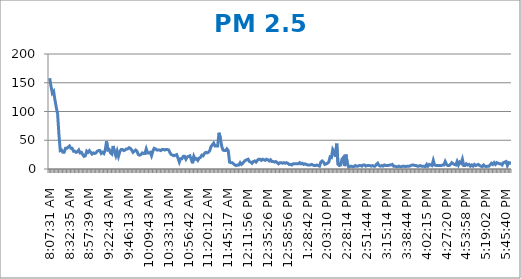
| Category | PM 2.5 (µg/m3) |
|---|---|
| 0.3385532407407407 | 158 |
| 0.3396412037037037 | 144 |
| 0.3407291666666667 | 132 |
| 0.3418171296296297 | 135 |
| 0.34290509259259255 | 120 |
| 0.34399305555555554 | 107 |
| 0.3450810185185185 | 96 |
| 0.34616898148148145 | 60 |
| 0.34725694444444444 | 32 |
| 0.34943287037037035 | 33 |
| 0.35052083333333334 | 29 |
| 0.3516087962962963 | 29 |
| 0.3526967592592593 | 36 |
| 0.3537847222222222 | 36 |
| 0.35487268518518517 | 38 |
| 0.35596064814814815 | 40 |
| 0.3570486111111111 | 36 |
| 0.35813657407407407 | 36 |
| 0.35922453703703705 | 31 |
| 0.36031250000000004 | 31 |
| 0.36140046296296297 | 29 |
| 0.36248842592592595 | 30 |
| 0.3646643518518518 | 33 |
| 0.3657523148148148 | 28 |
| 0.3668402777777778 | 29 |
| 0.3679282407407407 | 25 |
| 0.3690162037037037 | 22 |
| 0.3701041666666667 | 23 |
| 0.37119212962962966 | 31 |
| 0.3722800925925926 | 29 |
| 0.3733680555555556 | 32 |
| 0.37445601851851856 | 29 |
| 0.37554398148148144 | 26 |
| 0.3766319444444444 | 28 |
| 0.3777199074074074 | 27 |
| 0.37880787037037034 | 28 |
| 0.3798958333333333 | 31 |
| 0.3809837962962963 | 32 |
| 0.3820717592592593 | 32 |
| 0.3831597222222222 | 27 |
| 0.3842476851851852 | 29 |
| 0.3853356481481482 | 27 |
| 0.38642361111111106 | 33 |
| 0.38751157407407405 | 48 |
| 0.38968749999999996 | 33 |
| 0.39077546296296295 | 34 |
| 0.39186342592592593 | 28 |
| 0.3929513888888889 | 26 |
| 0.39403935185185185 | 40 |
| 0.39512731481481483 | 30 |
| 0.3962152777777778 | 23 |
| 0.3973032407407407 | 31 |
| 0.3983912037037037 | 22 |
| 0.39947916666666666 | 30 |
| 0.40056712962962965 | 34 |
| 0.4016550925925926 | 34 |
| 0.40274305555555556 | 32 |
| 0.40383101851851855 | 33 |
| 0.4049189814814815 | 35 |
| 0.40600694444444446 | 35 |
| 0.40709490740740745 | 37 |
| 0.4081828703703703 | 36 |
| 0.4092708333333333 | 33 |
| 0.4103587962962963 | 29 |
| 0.4114467592592593 | 31 |
| 0.4125347222222222 | 33 |
| 0.4136226851851852 | 31 |
| 0.4147106481481482 | 25 |
| 0.4157986111111111 | 24 |
| 0.4168865740740741 | 25 |
| 0.4179745370370371 | 28 |
| 0.41906249999999995 | 27 |
| 0.42015046296296293 | 27 |
| 0.4212384259259259 | 35 |
| 0.4223263888888889 | 28 |
| 0.42341435185185183 | 28 |
| 0.4245023148148148 | 29 |
| 0.4255902777777778 | 23 |
| 0.42667824074074073 | 31 |
| 0.4277662037037037 | 36 |
| 0.4288541666666667 | 35 |
| 0.4299421296296296 | 33 |
| 0.43103009259259256 | 33 |
| 0.43211805555555555 | 33 |
| 0.43320601851851853 | 32 |
| 0.43429398148148146 | 34 |
| 0.43538194444444445 | 34 |
| 0.43646990740740743 | 33 |
| 0.43755787037037036 | 34 |
| 0.43864583333333335 | 34 |
| 0.43973379629629633 | 33 |
| 0.4408217592592592 | 28 |
| 0.4419097222222222 | 25 |
| 0.4429976851851852 | 24 |
| 0.44408564814814816 | 23 |
| 0.4451736111111111 | 24 |
| 0.4462615740740741 | 25 |
| 0.44734953703703706 | 19 |
| 0.4484375 | 12 |
| 0.449525462962963 | 18 |
| 0.4506018518518518 | 18 |
| 0.4516898148148148 | 22 |
| 0.4527777777777778 | 22 |
| 0.4538657407407407 | 17 |
| 0.4549537037037037 | 21 |
| 0.4560416666666667 | 22 |
| 0.45712962962962966 | 23 |
| 0.4582175925925926 | 17 |
| 0.4593055555555556 | 10 |
| 0.46039351851851856 | 22 |
| 0.46148148148148144 | 17 |
| 0.4625694444444444 | 18 |
| 0.4636574074074074 | 15 |
| 0.46474537037037034 | 19 |
| 0.4658333333333333 | 20 |
| 0.4669212962962963 | 24 |
| 0.4680092592592593 | 23 |
| 0.4690972222222222 | 27 |
| 0.4701851851851852 | 29 |
| 0.4712731481481482 | 28 |
| 0.47236111111111106 | 29 |
| 0.47344907407407405 | 32 |
| 0.47453703703703703 | 39 |
| 0.47562499999999996 | 42 |
| 0.47671296296296295 | 45 |
| 0.47780092592592593 | 40 |
| 0.4788888888888889 | 40 |
| 0.47997685185185185 | 40 |
| 0.4821527777777778 | 63 |
| 0.4832407407407407 | 54 |
| 0.4843287037037037 | 40 |
| 0.48541666666666666 | 33 |
| 0.4865162037037037 | 32 |
| 0.48760416666666667 | 32 |
| 0.4886921296296296 | 35 |
| 0.4897800925925926 | 32 |
| 0.49086805555555557 | 12 |
| 0.4919560185185185 | 11 |
| 0.4930439814814815 | 11 |
| 0.49413194444444447 | 9 |
| 0.4952314814814815 | 7 |
| 0.4963194444444445 | 6 |
| 0.49740740740740735 | 7 |
| 0.49849537037037034 | 7 |
| 0.4995833333333333 | 11 |
| 0.5006712962962964 | 8 |
| 0.5039351851851852 | 10 |
| 0.5050231481481481 | 13 |
| 0.5061111111111111 | 15 |
| 0.507199074074074 | 16 |
| 0.508287037037037 | 17 |
| 0.509375 | 13 |
| 0.510462962962963 | 12 |
| 0.511550925925926 | 10 |
| 0.5126388888888889 | 13 |
| 0.5137268518518519 | 14 |
| 0.5148148148148148 | 12 |
| 0.5159027777777777 | 15 |
| 0.5169907407407407 | 17 |
| 0.5180787037037037 | 17 |
| 0.5191666666666667 | 15 |
| 0.5202546296296297 | 17 |
| 0.5213425925925926 | 16 |
| 0.5224305555555556 | 15 |
| 0.5235185185185185 | 17 |
| 0.5246064814814815 | 16 |
| 0.5256944444444445 | 14 |
| 0.5267824074074073 | 16 |
| 0.5278703703703703 | 13 |
| 0.5289583333333333 | 13 |
| 0.5300462962962963 | 12 |
| 0.5311342592592593 | 13 |
| 0.5322222222222223 | 11 |
| 0.5333101851851852 | 9 |
| 0.5343981481481481 | 11 |
| 0.5354861111111111 | 11 |
| 0.5365740740740741 | 10 |
| 0.537662037037037 | 11 |
| 0.53875 | 10 |
| 0.5398379629629629 | 11 |
| 0.5409259259259259 | 10 |
| 0.5420138888888889 | 8 |
| 0.5431018518518519 | 8 |
| 0.5441898148148149 | 7 |
| 0.5452777777777778 | 9 |
| 0.5463657407407407 | 9 |
| 0.5474537037037037 | 9 |
| 0.5485416666666666 | 9 |
| 0.5496296296296296 | 9 |
| 0.5507175925925926 | 11 |
| 0.5518055555555555 | 9 |
| 0.5528935185185185 | 10 |
| 0.5539814814814815 | 8 |
| 0.5572453703703704 | 9 |
| 0.5605092592592592 | 8 |
| 0.5615972222222222 | 7 |
| 0.5626851851851852 | 7 |
| 0.5659490740740741 | 7 |
| 0.567037037037037 | 8 |
| 0.568125 | 7 |
| 0.569212962962963 | 6 |
| 0.570300925925926 | 6 |
| 0.5724768518518518 | 7 |
| 0.5735648148148148 | 6 |
| 0.5790046296296296 | 5 |
| 0.5800925925925926 | 12 |
| 0.5811805555555556 | 14 |
| 0.5822685185185185 | 12 |
| 0.5833564814814814 | 8 |
| 0.5844444444444444 | 9 |
| 0.5855324074074074 | 10 |
| 0.5866203703703704 | 12 |
| 0.5877083333333334 | 21 |
| 0.5887962962962963 | 20 |
| 0.5898842592592592 | 34 |
| 0.5909722222222222 | 30 |
| 0.5931481481481481 | 21 |
| 0.5942361111111111 | 44 |
| 0.5953240740740741 | 8 |
| 0.596412037037037 | 6 |
| 0.5975 | 7 |
| 0.598587962962963 | 17 |
| 0.599675925925926 | 20 |
| 0.6007638888888889 | 5 |
| 0.6018518518518519 | 25 |
| 0.6029398148148148 | 10 |
| 0.6040277777777777 | 3 |
| 0.6051157407407407 | 5 |
| 0.6062037037037037 | 5 |
| 0.6072916666666667 | 4 |
| 0.6083796296296297 | 4 |
| 0.6094675925925926 | 6 |
| 0.6105555555555556 | 5 |
| 0.6116435185185185 | 5 |
| 0.6127314814814815 | 6 |
| 0.6138194444444445 | 6 |
| 0.6149074074074073 | 5 |
| 0.6159953703703703 | 7 |
| 0.6170833333333333 | 7 |
| 0.6181712962962963 | 5 |
| 0.6192592592592593 | 6 |
| 0.6203472222222223 | 6 |
| 0.6214351851851853 | 6 |
| 0.6225231481481481 | 5 |
| 0.6236111111111111 | 6 |
| 0.6246990740740741 | 5 |
| 0.625787037037037 | 5 |
| 0.626875 | 8 |
| 0.627962962962963 | 10 |
| 0.6290509259259259 | 6 |
| 0.6301388888888889 | 5 |
| 0.6312268518518519 | 6 |
| 0.6323148148148149 | 5 |
| 0.6334027777777778 | 7 |
| 0.6344907407407407 | 6 |
| 0.6355787037037037 | 6 |
| 0.6366666666666666 | 6 |
| 0.6377546296296296 | 7 |
| 0.6388425925925926 | 7 |
| 0.6399305555555556 | 8 |
| 0.6410185185185185 | 5 |
| 0.6421064814814815 | 5 |
| 0.6431944444444445 | 4 |
| 0.6442824074074074 | 4 |
| 0.6453703703703704 | 5 |
| 0.6464583333333334 | 4 |
| 0.6475462962962962 | 4 |
| 0.6486342592592592 | 5 |
| 0.6497222222222222 | 5 |
| 0.6508101851851852 | 4 |
| 0.6518981481481482 | 5 |
| 0.6529861111111112 | 5 |
| 0.6540740740740741 | 5 |
| 0.655162037037037 | 6 |
| 0.65625 | 7 |
| 0.657337962962963 | 7 |
| 0.6584259259259259 | 6 |
| 0.6595138888888888 | 6 |
| 0.6606018518518518 | 5 |
| 0.6616898148148148 | 5 |
| 0.6627777777777778 | 6 |
| 0.6638657407407408 | 5 |
| 0.6649537037037038 | 5 |
| 0.6660416666666666 | 5 |
| 0.6671296296296297 | 4 |
| 0.6682291666666668 | 8 |
| 0.6693171296296296 | 5 |
| 0.6704050925925925 | 8 |
| 0.6714930555555556 | 7 |
| 0.6725810185185185 | 6 |
| 0.6736805555555555 | 15 |
| 0.6747685185185185 | 7 |
| 0.6769444444444445 | 6 |
| 0.6780324074074073 | 6 |
| 0.6791203703703704 | 6 |
| 0.6802083333333333 | 6 |
| 0.6812962962962964 | 6 |
| 0.6823842592592593 | 7 |
| 0.6834722222222221 | 7 |
| 0.6845601851851852 | 13 |
| 0.6856481481481481 | 8 |
| 0.6878240740740741 | 6 |
| 0.6889120370370371 | 6 |
| 0.69 | 8 |
| 0.691087962962963 | 11 |
| 0.6921759259259259 | 9 |
| 0.6943518518518519 | 8 |
| 0.6954398148148148 | 7 |
| 0.6965277777777777 | 13 |
| 0.6976157407407407 | 7 |
| 0.6987037037037037 | 12 |
| 0.6997916666666667 | 10 |
| 0.7008796296296297 | 17 |
| 0.7019675925925926 | 6 |
| 0.7030555555555557 | 6 |
| 0.7041435185185185 | 9 |
| 0.7052314814814814 | 7 |
| 0.7074074074074074 | 8 |
| 0.7084953703703704 | 5 |
| 0.7095833333333333 | 7 |
| 0.7106712962962963 | 5 |
| 0.7117592592592592 | 8 |
| 0.7128472222222223 | 6 |
| 0.7139351851851852 | 7 |
| 0.715023148148148 | 8 |
| 0.7161111111111111 | 6 |
| 0.717199074074074 | 5 |
| 0.718287037037037 | 4 |
| 0.719375 | 7 |
| 0.720462962962963 | 5 |
| 0.721550925925926 | 4 |
| 0.7226388888888889 | 5 |
| 0.7237268518518518 | 5 |
| 0.7269907407407407 | 7 |
| 0.7280787037037038 | 10 |
| 0.7291666666666666 | 8 |
| 0.7302546296296296 | 11 |
| 0.7313425925925926 | 8 |
| 0.7324305555555556 | 11 |
| 0.7335185185185185 | 10 |
| 0.7346064814814816 | 9 |
| 0.7356944444444444 | 9 |
| 0.7367824074074073 | 7 |
| 0.7378703703703704 | 11 |
| 0.7389583333333333 | 12 |
| 0.7400462962962964 | 13 |
| 0.7411342592592592 | 6 |
| 0.7422222222222222 | 11 |
| 0.7433101851851852 | 10 |
| 0.7443981481481482 | 11 |